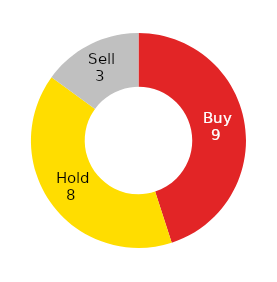
| Category | Series 0 |
|---|---|
| Buy | 9 |
| Hold | 8 |
| Sell | 3 |